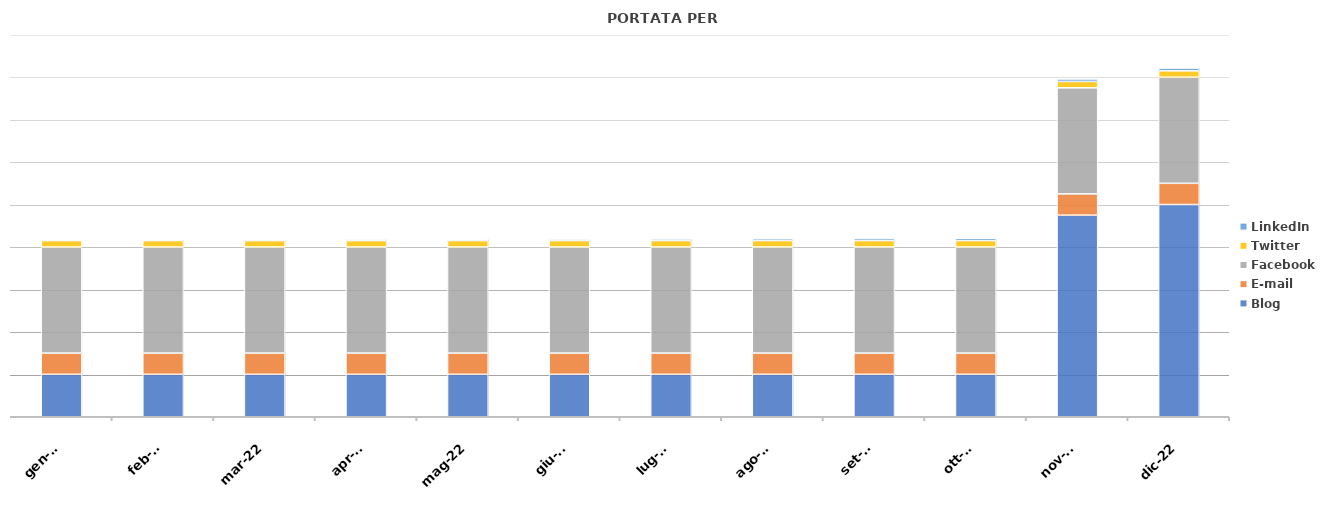
| Category | Blog | E-mail | Facebook | Twitter | LinkedIn |
|---|---|---|---|---|---|
| 2022-01-18 | 200 | 100 | 500 | 30 | 2 |
| 2022-02-18 | 200 | 100 | 500 | 30 | 3 |
| 2022-03-18 | 200 | 100 | 500 | 30 | 4 |
| 2022-04-18 | 200 | 100 | 500 | 30 | 5 |
| 2022-05-18 | 200 | 100 | 500 | 30 | 6 |
| 2022-06-18 | 200 | 100 | 500 | 30 | 7 |
| 2022-07-18 | 200 | 100 | 500 | 30 | 8 |
| 2022-08-18 | 200 | 100 | 500 | 30 | 9 |
| 2022-09-18 | 200 | 100 | 500 | 30 | 10 |
| 2022-10-18 | 200 | 100 | 500 | 30 | 11 |
| 2022-11-18 | 950 | 100 | 500 | 30 | 12 |
| 2022-12-18 | 1000 | 100 | 500 | 30 | 13 |